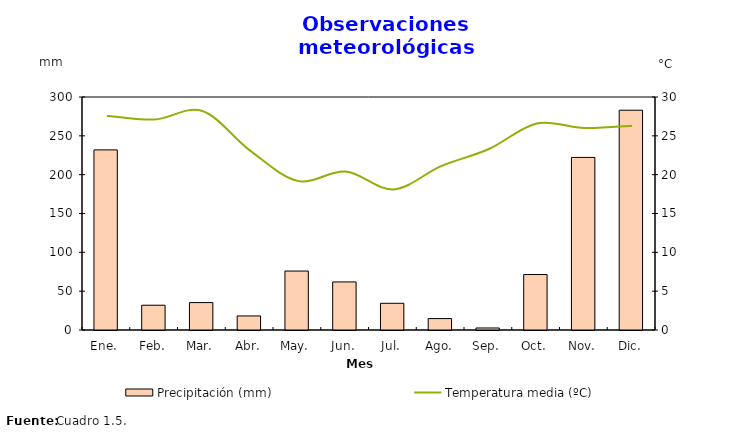
| Category | Precipitación (mm) |
|---|---|
| 0 | 231.9 |
| 1 | 31.9 |
| 2 | 35.3 |
| 3 | 18.1 |
| 4 | 75.9 |
| 5 | 61.9 |
| 6 | 34.4 |
| 7 | 14.7 |
| 8 | 2.6 |
| 9 | 71.4 |
| 10 | 222.2 |
| 11 | 283 |